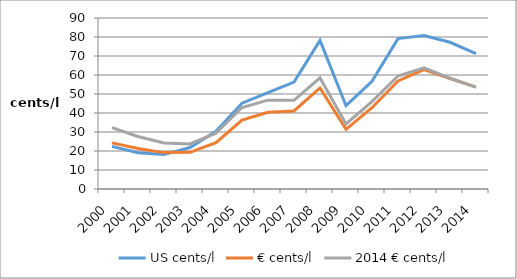
| Category | US cents/l | € cents/l | 2014 € cents/l |
|---|---|---|---|
| 2000.0 | 22.419 | 24.274 | 32.316 |
| 2001.0 | 19.117 | 21.346 | 27.646 |
| 2002.0 | 18.105 | 19.146 | 24.202 |
| 2003.0 | 21.812 | 19.282 | 23.74 |
| 2004.0 | 30.378 | 24.421 | 29.417 |
| 2005.0 | 45.178 | 36.314 | 42.893 |
| 2006.0 | 50.741 | 40.412 | 46.756 |
| 2007.0 | 56.266 | 41.055 | 46.648 |
| 2008.0 | 78.239 | 53.195 | 58.481 |
| 2009.0 | 43.833 | 31.426 | 34.282 |
| 2010.0 | 56.694 | 42.765 | 45.953 |
| 2011.0 | 79.148 | 56.859 | 59.445 |
| 2012.0 | 80.744 | 62.846 | 63.765 |
| 2013.0 | 77.229 | 58.15 | 58.289 |
| 2014.0 | 71.234 | 53.62 | 53.62 |